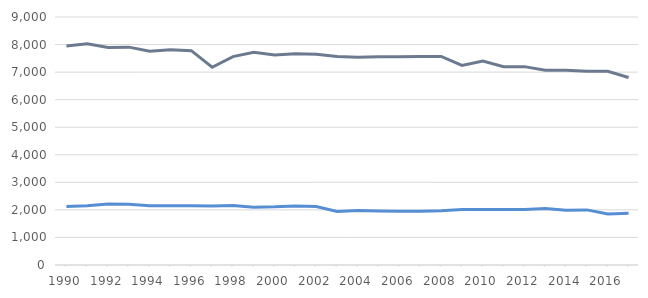
| Category | ArmyAuthStrength | AirAuthStrength |
|---|---|---|
| 1990.0 | 7944 | 2126 |
| 1991.0 | 8028 | 2149 |
| 1992.0 | 7894 | 2217 |
| 1993.0 | 7906 | 2202 |
| 1994.0 | 7756 | 2149 |
| 1995.0 | 7812 | 2146 |
| 1996.0 | 7779 | 2148 |
| 1997.0 | 7176 | 2142 |
| 1998.0 | 7564 | 2156 |
| 1999.0 | 7719 | 2098 |
| 2000.0 | 7623 | 2111 |
| 2001.0 | 7664 | 2142 |
| 2002.0 | 7648 | 2124 |
| 2003.0 | 7570 | 1940 |
| 2004.0 | 7543 | 1975 |
| 2005.0 | 7561 | 1963 |
| 2006.0 | 7557 | 1951 |
| 2007.0 | 7571 | 1953 |
| 2008.0 | 7569 | 1972 |
| 2009.0 | 7244 | 2013 |
| 2010.0 | 7400 | 2013 |
| 2011.0 | 7199 | 2013 |
| 2012.0 | 7199 | 2013 |
| 2013.0 | 7067 | 2047 |
| 2014.0 | 7066 | 1986 |
| 2015.0 | 7035 | 2000 |
| 2016.0 | 7030 | 1849 |
| 2017.0 | 6805 | 1882 |